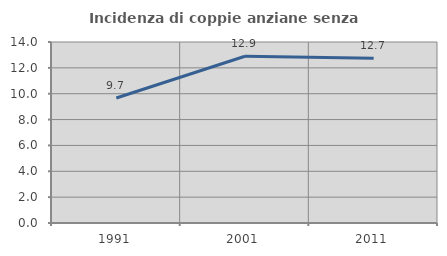
| Category | Incidenza di coppie anziane senza figli  |
|---|---|
| 1991.0 | 9.666 |
| 2001.0 | 12.898 |
| 2011.0 | 12.749 |